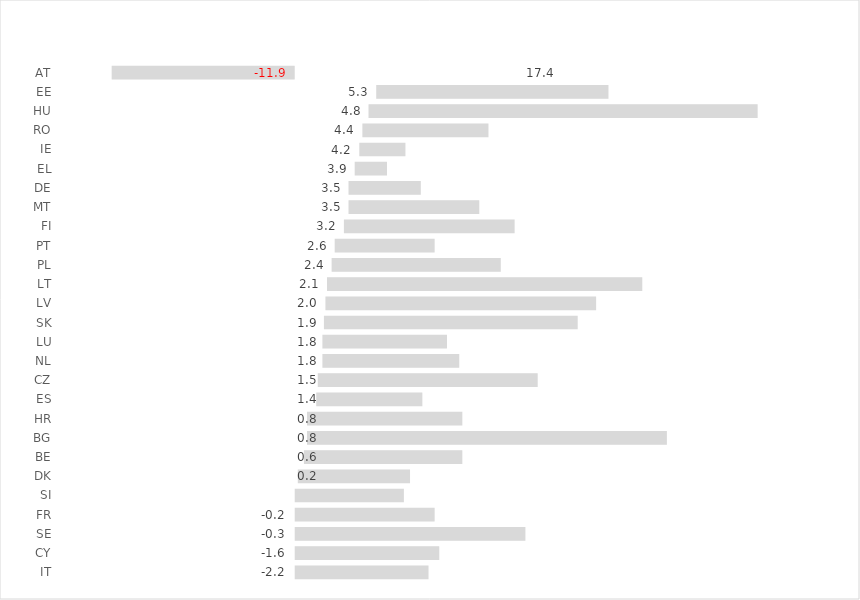
| Category | Series 0 | Series 1 | Dummy |
|---|---|---|---|
| AT | 17.4 | -11.9 | 0 |
| EE | 5.3 | 15.1 | 0 |
| HU | 4.8 | 25.3 | 0 |
| RO | 4.4 | 8.2 | 0 |
| IE | 4.2 | 3 | 0 |
| EL | 3.9 | 2.1 | 0 |
| DE | 3.5 | 4.7 | 0 |
| MT | 3.5 | 8.5 | 0 |
| FI | 3.2 | 11.1 | 0 |
| PT | 2.6 | 6.5 | 0 |
| PL | 2.4 | 11 | 0 |
| LT | 2.1 | 20.5 | 0 |
| LV | 2 | 17.6 | 0 |
| SK | 1.9 | 16.5 | 0 |
| LU | 1.8 | 8.1 | 0 |
| NL | 1.8 | 8.9 | 0 |
| CZ | 1.5 | 14.3 | 0 |
| ES | 1.4 | 6.9 | 0 |
| HR | 0.8 | 10.1 | 0 |
| BG | 0.8 | 23.4 | 0 |
| BE | 0.6 | 10.3 | 0 |
| DK | 0.2 | 7.3 | 0 |
| SI | 0 | 7.1 | 0 |
| FR | -0.2 | 9.1 | 0 |
| SE | -0.3 | 15 | 0 |
| CY | -1.6 | 9.4 | 0 |
| IT | -2.2 | 8.7 | 0 |